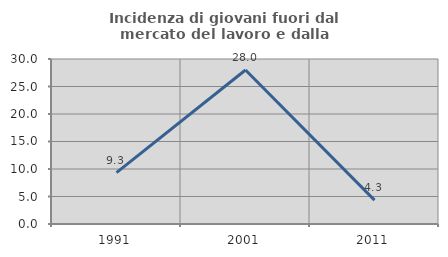
| Category | Incidenza di giovani fuori dal mercato del lavoro e dalla formazione  |
|---|---|
| 1991.0 | 9.333 |
| 2001.0 | 28 |
| 2011.0 | 4.348 |